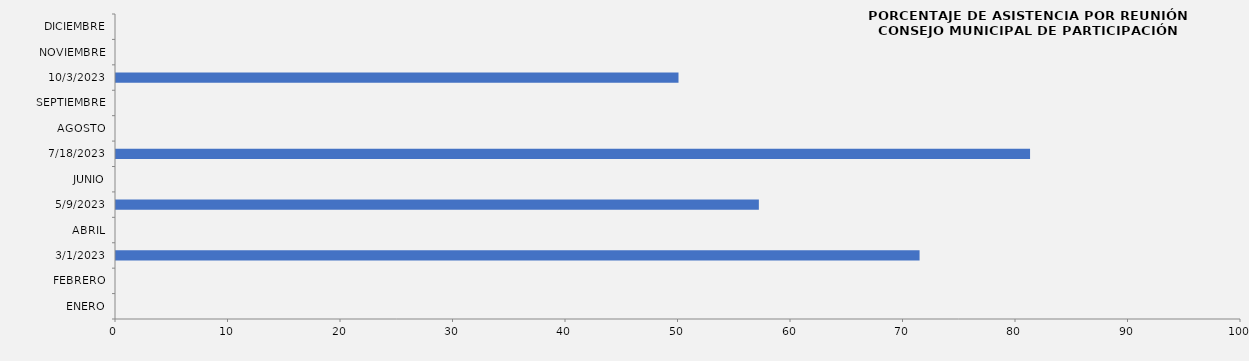
| Category | Series 0 |
|---|---|
| ENERO | 0 |
| FEBRERO | 0 |
| 01/03/2023 | 71.429 |
| ABRIL | 0 |
| 09/05/2023 | 57.143 |
| JUNIO | 0 |
| 18/07/2023 | 81.25 |
| AGOSTO | 0 |
| SEPTIEMBRE | 0 |
| 03/10/2023 | 50 |
| NOVIEMBRE | 0 |
| DICIEMBRE | 0 |